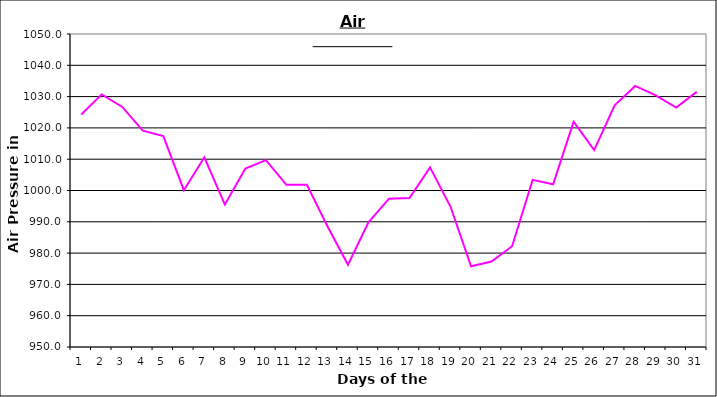
| Category | Series 0 |
|---|---|
| 0 | 1024.3 |
| 1 | 1030.7 |
| 2 | 1026.7 |
| 3 | 1019.1 |
| 4 | 1017.4 |
| 5 | 1000.1 |
| 6 | 1010.6 |
| 7 | 995.5 |
| 8 | 1007 |
| 9 | 1009.7 |
| 10 | 1001.8 |
| 11 | 1001.8 |
| 12 | 988.6 |
| 13 | 976.3 |
| 14 | 989.8 |
| 15 | 997.4 |
| 16 | 997.6 |
| 17 | 1007.4 |
| 18 | 994.8 |
| 19 | 975.8 |
| 20 | 977.3 |
| 21 | 982.2 |
| 22 | 1003.4 |
| 23 | 1002 |
| 24 | 1022 |
| 25 | 1012.9 |
| 26 | 1027.2 |
| 27 | 1033.4 |
| 28 | 1030.4 |
| 29 | 1026.5 |
| 30 | 1031.5 |